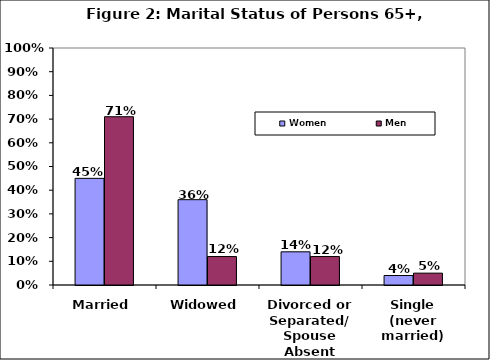
| Category | Women | Men |
|---|---|---|
| Married | 0.45 | 0.71 |
| Widowed | 0.36 | 0.12 |
| Divorced or Separated/ Spouse Absent | 0.14 | 0.12 |
| Single (never married) | 0.04 | 0.05 |